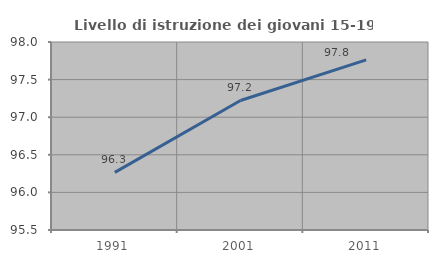
| Category | Livello di istruzione dei giovani 15-19 anni |
|---|---|
| 1991.0 | 96.266 |
| 2001.0 | 97.222 |
| 2011.0 | 97.762 |